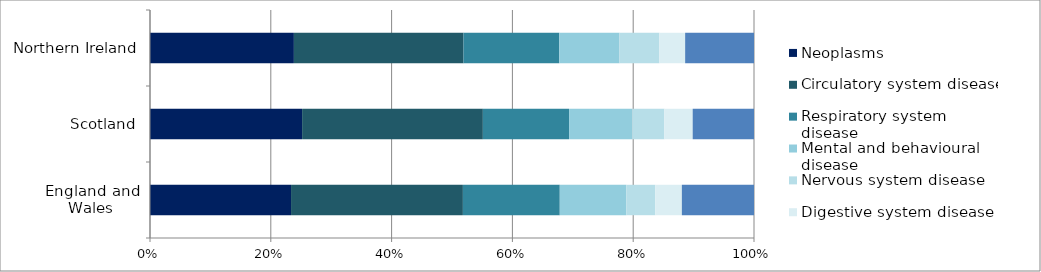
| Category | Neoplasms | Circulatory system disease | Respiratory system disease | Mental and behavioural disease | Nervous system disease | Digestive system disease | Other diseases |
|---|---|---|---|---|---|---|---|
| England and Wales | 53655 | 65381 | 36854 | 25292 | 11021 | 10129 | 27448 |
| Scotland | 6143 | 7300 | 3483 | 2558 | 1290 | 1143 | 2476 |
| Northern Ireland | 1580 | 1862 | 1052 | 661 | 438 | 283 | 756 |